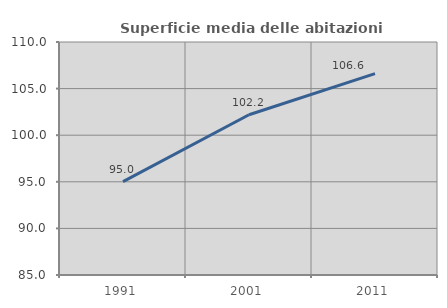
| Category | Superficie media delle abitazioni occupate |
|---|---|
| 1991.0 | 95.02 |
| 2001.0 | 102.198 |
| 2011.0 | 106.606 |